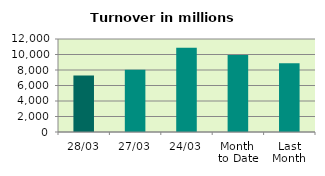
| Category | Series 0 |
|---|---|
| 28/03 | 7292.821 |
| 27/03 | 8042.344 |
| 24/03 | 10855.579 |
| Month 
to Date | 9943.391 |
| Last
Month | 8884.685 |